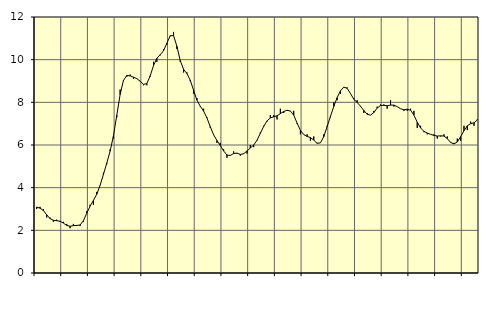
| Category | Piggar | Series 1 |
|---|---|---|
| nan | 3 | 3.09 |
| 87.0 | 3.1 | 3.04 |
| 87.0 | 3 | 2.93 |
| 87.0 | 2.6 | 2.73 |
| nan | 2.6 | 2.55 |
| 88.0 | 2.4 | 2.47 |
| 88.0 | 2.5 | 2.45 |
| 88.0 | 2.4 | 2.43 |
| nan | 2.4 | 2.34 |
| 89.0 | 2.3 | 2.23 |
| 89.0 | 2.1 | 2.19 |
| 89.0 | 2.3 | 2.22 |
| nan | 2.2 | 2.23 |
| 90.0 | 2.2 | 2.25 |
| 90.0 | 2.4 | 2.45 |
| 90.0 | 2.9 | 2.8 |
| nan | 3.2 | 3.13 |
| 91.0 | 3.2 | 3.4 |
| 91.0 | 3.8 | 3.69 |
| 91.0 | 4.1 | 4.11 |
| nan | 4.7 | 4.62 |
| 92.0 | 5.1 | 5.15 |
| 92.0 | 5.8 | 5.71 |
| 92.0 | 6.3 | 6.43 |
| nan | 7.3 | 7.39 |
| 93.0 | 8.6 | 8.37 |
| 93.0 | 9 | 9.03 |
| 93.0 | 9.2 | 9.26 |
| nan | 9.3 | 9.24 |
| 94.0 | 9.1 | 9.18 |
| 94.0 | 9.1 | 9.11 |
| 94.0 | 9 | 8.99 |
| nan | 8.8 | 8.84 |
| 95.0 | 8.8 | 8.88 |
| 95.0 | 9.2 | 9.24 |
| 95.0 | 9.9 | 9.72 |
| nan | 9.9 | 10.07 |
| 96.0 | 10.2 | 10.23 |
| 96.0 | 10.5 | 10.42 |
| 96.0 | 10.7 | 10.77 |
| nan | 11.1 | 11.12 |
| 97.0 | 11.3 | 11.13 |
| 97.0 | 10.5 | 10.63 |
| 97.0 | 9.9 | 9.96 |
| nan | 9.4 | 9.55 |
| 98.0 | 9.4 | 9.35 |
| 98.0 | 9 | 9.04 |
| 98.0 | 8.4 | 8.57 |
| nan | 8.2 | 8.1 |
| 99.0 | 7.8 | 7.82 |
| 99.0 | 7.7 | 7.59 |
| 99.0 | 7.3 | 7.27 |
| nan | 6.8 | 6.86 |
| 0.0 | 6.5 | 6.48 |
| 0.0 | 6.1 | 6.21 |
| 0.0 | 6.1 | 5.98 |
| nan | 5.8 | 5.72 |
| 1.0 | 5.4 | 5.53 |
| 1.0 | 5.5 | 5.51 |
| 1.0 | 5.7 | 5.6 |
| nan | 5.6 | 5.62 |
| 2.0 | 5.5 | 5.56 |
| 2.0 | 5.6 | 5.59 |
| 2.0 | 5.6 | 5.72 |
| nan | 6 | 5.86 |
| 3.0 | 5.9 | 6 |
| 3.0 | 6.2 | 6.22 |
| 3.0 | 6.6 | 6.55 |
| nan | 6.9 | 6.87 |
| 4.0 | 7.1 | 7.13 |
| 4.0 | 7.4 | 7.27 |
| 4.0 | 7.4 | 7.32 |
| nan | 7.2 | 7.37 |
| 5.0 | 7.7 | 7.47 |
| 5.0 | 7.5 | 7.57 |
| 5.0 | 7.6 | 7.63 |
| nan | 7.6 | 7.59 |
| 6.0 | 7.6 | 7.4 |
| 6.0 | 7 | 7.03 |
| 6.0 | 6.5 | 6.69 |
| nan | 6.5 | 6.49 |
| 7.0 | 6.5 | 6.4 |
| 7.0 | 6.2 | 6.35 |
| 7.0 | 6.4 | 6.23 |
| nan | 6.1 | 6.08 |
| 8.0 | 6.1 | 6.1 |
| 8.0 | 6.5 | 6.39 |
| 8.0 | 6.9 | 6.86 |
| nan | 7.3 | 7.34 |
| 9.0 | 8 | 7.81 |
| 9.0 | 8.1 | 8.22 |
| 9.0 | 8.4 | 8.54 |
| nan | 8.7 | 8.71 |
| 10.0 | 8.7 | 8.66 |
| 10.0 | 8.4 | 8.41 |
| 10.0 | 8.2 | 8.15 |
| nan | 8.1 | 7.99 |
| 11.0 | 7.8 | 7.82 |
| 11.0 | 7.5 | 7.62 |
| 11.0 | 7.5 | 7.44 |
| nan | 7.4 | 7.4 |
| 12.0 | 7.6 | 7.52 |
| 12.0 | 7.8 | 7.73 |
| 12.0 | 7.9 | 7.85 |
| nan | 7.9 | 7.86 |
| 13.0 | 7.7 | 7.84 |
| 13.0 | 8.1 | 7.87 |
| 13.0 | 7.8 | 7.87 |
| nan | 7.8 | 7.8 |
| 14.0 | 7.7 | 7.7 |
| 14.0 | 7.6 | 7.65 |
| 14.0 | 7.6 | 7.68 |
| nan | 7.7 | 7.63 |
| 15.0 | 7.6 | 7.4 |
| 15.0 | 6.8 | 7.07 |
| 15.0 | 6.9 | 6.8 |
| nan | 6.6 | 6.64 |
| 16.0 | 6.5 | 6.56 |
| 16.0 | 6.5 | 6.5 |
| 16.0 | 6.5 | 6.45 |
| nan | 6.3 | 6.42 |
| 17.0 | 6.4 | 6.43 |
| 17.0 | 6.5 | 6.42 |
| 17.0 | 6.4 | 6.3 |
| nan | 6.1 | 6.12 |
| 18.0 | 6.1 | 6.05 |
| 18.0 | 6.3 | 6.14 |
| 18.0 | 6.2 | 6.39 |
| nan | 6.9 | 6.67 |
| 19.0 | 6.7 | 6.9 |
| 19.0 | 7.1 | 7 |
| 19.0 | 6.9 | 7.04 |
| nan | 7.2 | 7.17 |